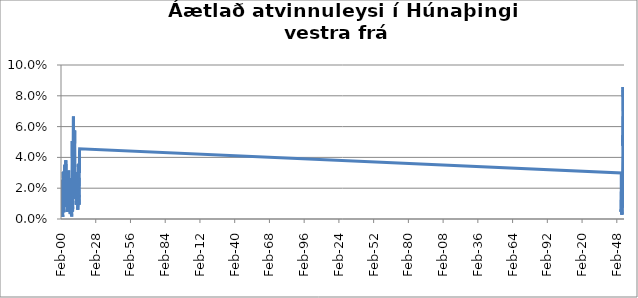
| Category | Series 0 |
|---|---|
| 2000-02-01 | 0.026 |
| 2000-03-01 | 0.024 |
| 2000-04-01 | 0.016 |
| 2000-05-01 | 0.006 |
| 2000-06-01 | 0.003 |
| 2000-07-01 | 0.001 |
| 2000-08-01 | 0.001 |
| 2000-09-01 | 0.004 |
| 2000-10-01 | 0.004 |
| 2000-11-01 | 0.006 |
| 2000-12-01 | 0.013 |
| 2001-01-01 | 0.013 |
| 2001-02-01 | 0.009 |
| 2001-03-01 | 0.013 |
| 2001-04-01 | 0.012 |
| 2001-05-01 | 0.006 |
| 2001-06-01 | 0.001 |
| 2001-07-01 | 0.001 |
| 2001-08-01 | 0.003 |
| 2001-09-01 | 0.003 |
| 2001-10-01 | 0.013 |
| 2001-11-01 | 0.017 |
| 2001-12-01 | 0.031 |
| 2002-01-01 | 0.026 |
| 2002-02-01 | 0.031 |
| 2002-03-01 | 0.023 |
| 2002-04-01 | 0.015 |
| 2002-05-01 | 0.012 |
| 2002-06-01 | 0.006 |
| 2002-07-01 | 0.004 |
| 2002-08-01 | 0.006 |
| 2002-09-01 | 0.012 |
| 2002-10-01 | 0.009 |
| 2002-11-01 | 0.019 |
| 2002-12-01 | 0.028 |
| 2003-01-01 | 0.032 |
| 2003-02-01 | 0.035 |
| 2003-03-01 | 0.025 |
| 2003-04-01 | 0.028 |
| 2003-05-01 | 0.021 |
| 2003-06-01 | 0.015 |
| 2003-07-01 | 0.016 |
| 2003-08-01 | 0.016 |
| 2003-09-01 | 0.019 |
| 2003-10-01 | 0.016 |
| 2003-11-01 | 0.027 |
| 2003-12-01 | 0.027 |
| 2004-01-01 | 0.038 |
| 2004-02-01 | 0.025 |
| 2004-03-01 | 0.024 |
| 2004-04-01 | 0.02 |
| 2004-05-01 | 0.02 |
| 2004-06-01 | 0.009 |
| 2004-07-01 | 0.008 |
| 2004-08-01 | 0.009 |
| 2004-09-01 | 0.008 |
| 2004-10-01 | 0.013 |
| 2004-11-01 | 0.025 |
| 2004-12-01 | 0.022 |
| 2005-01-01 | 0.025 |
| 2005-02-01 | 0.022 |
| 2005-03-01 | 0.022 |
| 2005-04-01 | 0.02 |
| 2005-05-01 | 0.008 |
| 2005-06-01 | 0.006 |
| 2005-07-01 | 0.005 |
| 2005-08-01 | 0.008 |
| 2005-09-01 | 0.005 |
| 2005-10-01 | 0.014 |
| 2005-11-01 | 0.024 |
| 2005-12-01 | 0.027 |
| 2006-01-01 | 0.024 |
| 2006-02-01 | 0.024 |
| 2006-03-01 | 0.028 |
| 2006-04-01 | 0.031 |
| 2006-05-01 | 0.012 |
| 2006-06-01 | 0.007 |
| 2006-07-01 | 0.006 |
| 2006-08-01 | 0.006 |
| 2006-09-01 | 0.006 |
| 2006-10-01 | 0.009 |
| 2006-11-01 | 0.012 |
| 2006-12-01 | 0.016 |
| 2007-01-01 | 0.027 |
| 2007-02-01 | 0.027 |
| 2007-03-01 | 0.02 |
| 2007-04-01 | 0.012 |
| 2007-05-01 | 0.008 |
| 2007-06-01 | 0.005 |
| 2007-07-01 | 0.005 |
| 2007-08-01 | 0.003 |
| 2007-09-01 | 0.006 |
| 2007-10-01 | 0.007 |
| 2007-11-01 | 0.007 |
| 2007-12-01 | 0.007 |
| 2008-01-01 | 0.008 |
| 2008-02-01 | 0.011 |
| 2008-03-01 | 0.015 |
| 2008-04-01 | 0.014 |
| 2008-05-01 | 0.012 |
| 2008-06-01 | 0.006 |
| 2008-07-01 | 0.006 |
| 2008-08-01 | 0.003 |
| 2008-09-01 | 0.002 |
| 2008-10-01 | 0.003 |
| 2008-11-01 | 0.013 |
| 2008-12-01 | 0.017 |
| 2009-01-01 | 0.03 |
| 2009-02-01 | 0.037 |
| 2009-03-01 | 0.051 |
| 2009-04-01 | 0.041 |
| 2009-05-01 | 0.031 |
| 2009-06-01 | 0.005 |
| 2009-07-01 | 0.008 |
| 2009-08-01 | 0.008 |
| 2009-09-01 | 0.015 |
| 2009-10-01 | 0.025 |
| 2009-11-01 | 0.042 |
| 2009-12-01 | 0.047 |
| 2010-01-01 | 0.061 |
| 2010-02-01 | 0.067 |
| 2010-03-01 | 0.061 |
| 2010-04-01 | 0.049 |
| 2010-05-01 | 0.031 |
| 2010-06-01 | 0.016 |
| 2010-07-01 | 0.02 |
| 2010-08-01 | 0.018 |
| 2010-09-01 | 0.013 |
| 2010-10-01 | 0.028 |
| 2010-11-01 | 0.038 |
| 2010-12-01 | 0.043 |
| 2011-01-01 | 0.054 |
| 2011-02-01 | 0.058 |
| 2011-03-01 | 0.049 |
| 2011-04-01 | 0.041 |
| 2011-05-01 | 0.021 |
| 2011-06-01 | 0.021 |
| 2011-07-01 | 0.019 |
| 2011-08-01 | 0.014 |
| 2011-09-01 | 0.014 |
| 2011-10-01 | 0.018 |
| 2011-11-01 | 0.025 |
| 2011-12-01 | 0.028 |
| 2012-01-01 | 0.026 |
| 2012-02-01 | 0.027 |
| 2012-03-01 | 0.021 |
| 2012-04-01 | 0.018 |
| 2012-05-01 | 0.017 |
| 2012-06-01 | 0.009 |
| 2012-07-01 | 0.012 |
| 2012-08-01 | 0.014 |
| 2012-09-01 | 0.016 |
| 2012-10-01 | 0.023 |
| 2012-11-01 | 0.031 |
| 2012-12-01 | 0.031 |
| 2013-01-01 | 0.027 |
| 2013-02-01 | 0.026 |
| 2013-03-01 | 0.013 |
| 2013-04-01 | 0.012 |
| 2013-05-01 | 0.012 |
| 2013-06-01 | 0.012 |
| 2013-07-01 | 0.012 |
| 2013-08-01 | 0.011 |
| 2013-09-01 | 0.006 |
| 2013-10-01 | 0.014 |
| 2013-11-01 | 0.019 |
| 2013-12-01 | 0.027 |
| 2014-01-01 | 0.036 |
| 2014-02-01 | 0.034 |
| 2014-03-01 | 0.031 |
| 2014-04-01 | 0.025 |
| 2014-05-01 | 0.014 |
| 2014-06-01 | 0.016 |
| 2014-07-01 | 0.016 |
| 2014-08-01 | 0.009 |
| 2014-09-01 | 0.009 |
| 2014-10-01 | 0.027 |
| 2014-11-01 | 0.036 |
| 2014-12-01 | 0.03 |
| 2015-01-01 | 0.044 |
| 2015-02-01 | 0.046 |
| 201503.0 | 0.03 |
| 201504.0 | 0.026 |
| 201505.0 | 0.012 |
| 201506.0 | 0.008 |
| 201507.0 | 0.008 |
| 201508.0 | 0.005 |
| 201509.0 | 0.006 |
| 201510.0 | 0.005 |
| 201511.0 | 0.012 |
| 201512.0 | 0.017 |
| 201601.0 | 0.02 |
| 201602.0 | 0.022 |
| 201603.0 | 0.023 |
| 201604.0 | 0.02 |
| 201605.0 | 0.012 |
| 201606.0 | 0.011 |
| 201607.0 | 0.006 |
| 201608.0 | 0.003 |
| 201609.0 | 0.006 |
| 201610.0 | 0.012 |
| 201611.0 | 0.013 |
| 201612.0 | 0.015 |
| 201701.0 | 0.016 |
| 201702.0 | 0.015 |
| 201703.0 | 0.01 |
| 201704.0 | 0.01 |
| 201705.0 | 0.009 |
| 201706.0 | 0.003 |
| 201707.0 | 0.004 |
| 201708.0 | 0.006 |
| 201709.0 | 0.007 |
| 201710.0 | 0.013 |
| 201711.0 | 0.016 |
| 201712.0 | 0.018 |
| 201801.0 | 0.024 |
| 201802.0 | 0.021 |
| 201803.0 | 0.016 |
| 201804.0 | 0.013 |
| 201805.0 | 0.012 |
| 201806.0 | 0.007 |
| 201807.0 | 0.009 |
| 201808.0 | 0.011 |
| 201809.0 | 0.012 |
| 201810.0 | 0.012 |
| 201811.0 | 0.021 |
| 201812.0 | 0.024 |
| 201901.0 | 0.025 |
| 201902.0 | 0.022 |
| 201903.0 | 0.021 |
| 201904.0 | 0.016 |
| 201905.0 | 0.013 |
| 201906.0 | 0.013 |
| 201907.0 | 0.018 |
| 201908.0 | 0.02 |
| 201909.0 | 0.017 |
| 201910.0 | 0.025 |
| 201911.0 | 0.022 |
| 201912.0 | 0.028 |
| 202001.0 | 0.038 |
| 202002.0 | 0.038 |
| 202003.0 | 0.054 |
| 202004.0 | 0.05 |
| 202005.0 | 0.052 |
| 202006.0 | 0.052 |
| 202007.0 | 0.052 |
| 202008.0 | 0.052 |
| 202009.0 | 0.048 |
| 202010.0 | 0.067 |
| 202011.0 | 0.075 |
| 202012.0 | 0.086 |
| 202101.0 | 0.082 |
| 202102.0 | 0.079 |
| 202103.0 | 0.084 |
| 202104.0 | 0.07 |
| 202105.0 | 0.055 |
| 202106.0 | 0.043 |
| 202107.0 | 0.035 |
| 202108.0 | 0.027 |
| 202109.0 | 0.026 |
| 202110.0 | 0.031 |
| 202111.0 | 0.04 |
| 202112.0 | 0.04 |
| 202201.0 | 0.043 |
| 202202.0 | 0.049 |
| 202203.0 | 0.04 |
| 202204.0 | 0.033 |
| 202205.0 | 0.019 |
| 202206.0 | 0.018 |
| 202207.0 | 0.014 |
| 202208.0 | 0.014 |
| 202209.0 | 0.013 |
| 202210.0 | 0.019 |
| 202211.0 | 0.02 |
| 202212.0 | 0.024 |
| 202301.0 | 0.027 |
| 202302.0 | 0.02 |
| 202303.0 | 0.019 |
| 202304.0 | 0.014 |